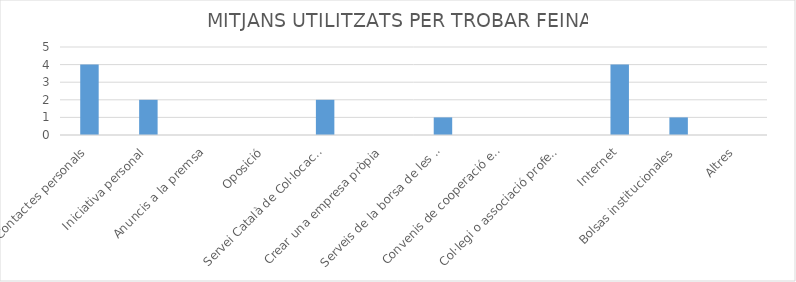
| Category | Series 0 |
|---|---|
| Contactes personals | 4 |
| Iniciativa personal | 2 |
| Anuncis a la premsa | 0 |
| Oposició | 0 |
| Servei Català de Col·locació | 2 |
| Crear una empresa pròpia | 0 |
| Serveis de la borsa de les universitats | 1 |
| Convenis de cooperació educativa | 0 |
| Col·legi o associació professional | 0 |
| Internet | 4 |
| Bolsas institucionales | 1 |
| Altres | 0 |